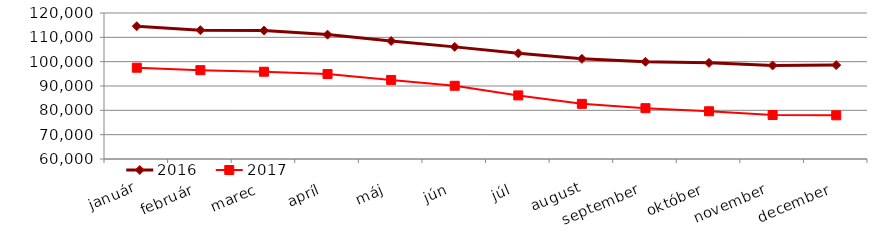
| Category | 2016 | 2017 |
|---|---|---|
| január | 114575 | 97513 |
| február | 112951 | 96506 |
| marec | 112770 | 95868 |
| apríl | 111119 | 94910 |
| máj | 108502 | 92491 |
| jún | 106080 | 90095 |
| júl | 103422 | 86132 |
| august | 101166 | 82673 |
| september | 99959 | 80886 |
| október | 99507 | 79611 |
| november | 98441 | 78076 |
| december | 98592 | 77961 |